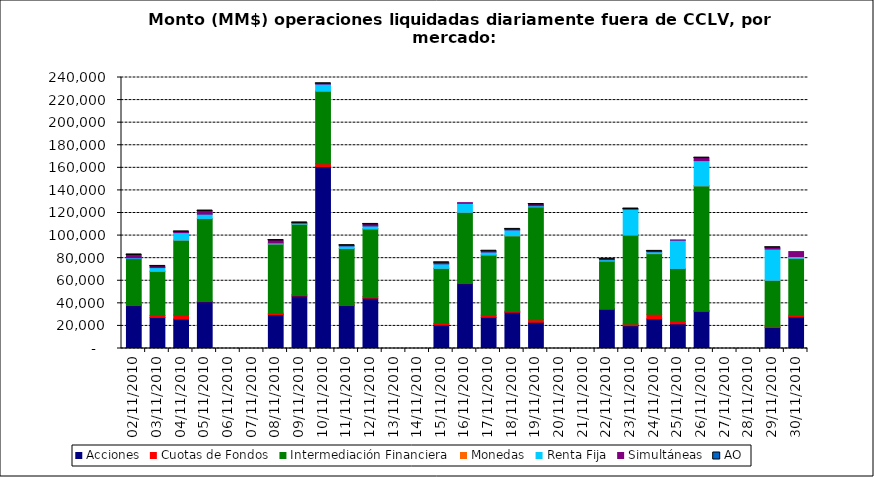
| Category | Acciones | Cuotas de Fondos | Intermediación Financiera | Monedas | Renta Fija | Simultáneas | AO |
|---|---|---|---|---|---|---|---|
| 02/11/2010 | 37999.995 | 964.059 | 40685.739 | 2.075 | 642.735 | 2547.002 | 0.178 |
| 03/11/2010 | 27548.022 | 1758.342 | 39122.859 | 9.962 | 3221.385 | 1026.171 | 0.675 |
| 04/11/2010 | 26058.071 | 3588.805 | 66296.45 | 45.707 | 6679.642 | 596.023 | 0.531 |
| 05/11/2010 | 41467.384 | 243.363 | 73438.655 | 12.12 | 3798.034 | 2768.275 | 0.778 |
| 08/11/2010 | 29997.258 | 1203.224 | 61348.499 | 10.116 | 973.922 | 2119.275 | 0.039 |
| 09/11/2010 | 46578.438 | 1086.463 | 62447.275 | 6.751 | 883.313 | 201.937 | 0.061 |
| 10/11/2010 | 161147.398 | 2517.551 | 64320.097 | 21.003 | 6146.962 | 290.143 | 0.116 |
| 11/11/2010 | 38017.459 | 883.661 | 49698.752 | 1.26 | 2261.573 | 213.344 | 1.322 |
| 12/11/2010 | 44622.574 | 1393.898 | 59973.464 | 3.16 | 2526.225 | 1358.077 | 0.163 |
| 15/11/2010 | 20784.983 | 1435.81 | 48775.631 | 11.805 | 3975.082 | 893.444 | 0.228 |
| 16/11/2010 | 57457.532 | 280.571 | 62892.761 | 8.436 | 7925.46 | 621.511 | 0 |
| 17/11/2010 | 27644.054 | 1836.651 | 53407.51 | 0.844 | 2556.636 | 689.473 | 0.079 |
| 18/11/2010 | 32126.648 | 872.792 | 66814.02 | 13.972 | 5196.291 | 458.085 | 2.931 |
| 19/11/2010 | 23248.146 | 2241.438 | 99986.455 | 12.925 | 933.079 | 1104.776 | 0.034 |
| 22/11/2010 | 34858.434 | 172.101 | 42514.197 | 4.29 | 1111.651 | 379.018 | 0.123 |
| 23/11/2010 | 20188.429 | 1487.917 | 78910.736 | 6.88 | 22787.523 | 128.147 | 0.005 |
| 24/11/2010 | 26216.049 | 4042.683 | 53787.376 | 4.994 | 1623.831 | 338.577 | 0.014 |
| 25/11/2010 | 21878.112 | 2114.18 | 46899.353 | 14.555 | 24968.865 | 269.647 | 0 |
| 26/11/2010 | 32865.472 | 843.951 | 110345.149 | 5.219 | 22344.278 | 2187.745 | 0.112 |
| 29/11/2010 | 18548.119 | 1081.618 | 40790.308 | 22 | 27626.441 | 1193.905 | 0.385 |
| 30/11/2010 | 27971.097 | 1493.035 | 50449.661 | 6.023 | 1539.801 | 4372.179 | 0 |